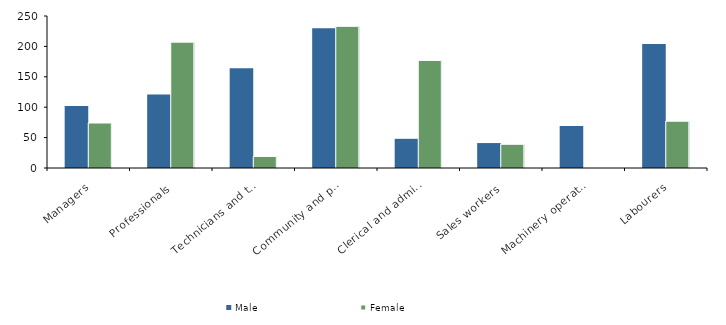
| Category | Male | Female |
|---|---|---|
| Managers | 102 | 74 |
| Professionals | 121 | 207 |
| Technicians and trades workers | 164 | 19 |
| Community and personal service workers | 230 | 233 |
| Clerical and administrative workers | 48 | 177 |
| Sales workers | 41 | 39 |
| Machinery operators and drivers | 69 | 0 |
| Labourers | 204 | 77 |